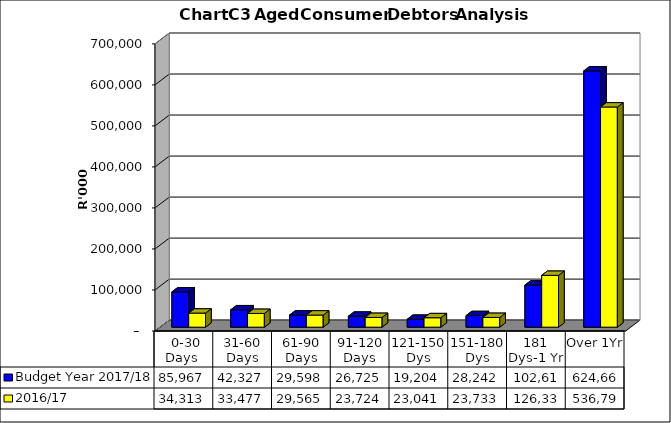
| Category | Budget Year 2017/18 | 2016/17 |
|---|---|---|
|  0-30 Days  | 85966659.92 | 34313010.89 |
| 31-60 Days | 42326806.75 | 33476552.36 |
| 61-90 Days | 29598434.88 | 29564638.62 |
| 91-120 Days | 26724867.18 | 23724431.97 |
| 121-150 Dys | 19203747.5 | 23041302.25 |
| 151-180 Dys | 28242060.36 | 23732923.21 |
| 181 Dys-1 Yr | 102618541.49 | 126337166.77 |
| Over 1Yr | 624664501.5 | 536798159.67 |